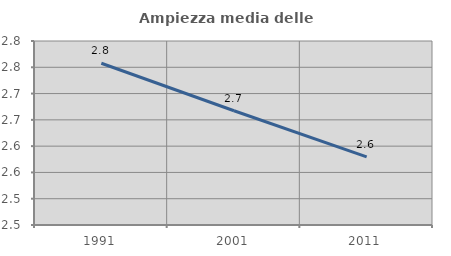
| Category | Ampiezza media delle famiglie |
|---|---|
| 1991.0 | 2.758 |
| 2001.0 | 2.667 |
| 2011.0 | 2.579 |